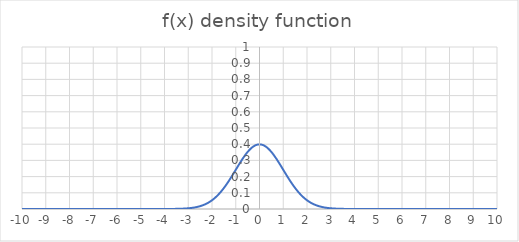
| Category | Series 0 |
|---|---|
| -10.0 | 0 |
| -9.9 | 0 |
| -9.8 | 0 |
| -9.7 | 0 |
| -9.6 | 0 |
| -9.5 | 0 |
| -9.4 | 0 |
| -9.3 | 0 |
| -9.2 | 0 |
| -9.1 | 0 |
| -9.0 | 0 |
| -8.9 | 0 |
| -8.8 | 0 |
| -8.7 | 0 |
| -8.6 | 0 |
| -8.50000000000001 | 0 |
| -8.40000000000001 | 0 |
| -8.30000000000001 | 0 |
| -8.20000000000001 | 0 |
| -8.10000000000001 | 0 |
| -8.00000000000001 | 0 |
| -7.90000000000001 | 0 |
| -7.80000000000001 | 0 |
| -7.70000000000001 | 0 |
| -7.60000000000001 | 0 |
| -7.50000000000001 | 0 |
| -7.40000000000001 | 0 |
| -7.30000000000001 | 0 |
| -7.20000000000001 | 0 |
| -7.10000000000001 | 0 |
| -7.00000000000001 | 0 |
| -6.90000000000001 | 0 |
| -6.80000000000001 | 0 |
| -6.70000000000001 | 0 |
| -6.60000000000001 | 0 |
| -6.50000000000001 | 0 |
| -6.40000000000001 | 0 |
| -6.30000000000001 | 0 |
| -6.20000000000001 | 0 |
| -6.10000000000001 | 0 |
| -6.00000000000001 | 0 |
| -5.90000000000001 | 0 |
| -5.80000000000001 | 0 |
| -5.70000000000002 | 0 |
| -5.60000000000002 | 0 |
| -5.50000000000002 | 0 |
| -5.40000000000002 | 0 |
| -5.30000000000002 | 0 |
| -5.20000000000002 | 0 |
| -5.10000000000002 | 0 |
| -5.00000000000002 | 0 |
| -4.90000000000002 | 0 |
| -4.80000000000002 | 0 |
| -4.70000000000002 | 0 |
| -4.60000000000002 | 0 |
| -4.50000000000002 | 0 |
| -4.40000000000002 | 0 |
| -4.30000000000002 | 0 |
| -4.20000000000002 | 0 |
| -4.10000000000002 | 0 |
| -4.00000000000002 | 0 |
| -3.90000000000002 | 0 |
| -3.80000000000002 | 0 |
| -3.70000000000002 | 0 |
| -3.60000000000002 | 0.001 |
| -3.50000000000002 | 0.001 |
| -3.40000000000002 | 0.001 |
| -3.30000000000002 | 0.002 |
| -3.20000000000002 | 0.002 |
| -3.10000000000002 | 0.003 |
| -3.00000000000002 | 0.004 |
| -2.90000000000003 | 0.006 |
| -2.80000000000003 | 0.008 |
| -2.70000000000003 | 0.01 |
| -2.60000000000003 | 0.014 |
| -2.50000000000003 | 0.018 |
| -2.40000000000003 | 0.022 |
| -2.30000000000003 | 0.028 |
| -2.20000000000003 | 0.035 |
| -2.10000000000003 | 0.044 |
| -2.00000000000003 | 0.054 |
| -1.90000000000003 | 0.066 |
| -1.80000000000003 | 0.079 |
| -1.70000000000003 | 0.094 |
| -1.60000000000003 | 0.111 |
| -1.50000000000003 | 0.13 |
| -1.40000000000003 | 0.15 |
| -1.30000000000003 | 0.171 |
| -1.20000000000003 | 0.194 |
| -1.10000000000003 | 0.218 |
| -1.00000000000003 | 0.242 |
| -0.900000000000031 | 0.266 |
| -0.800000000000029 | 0.29 |
| -0.700000000000029 | 0.312 |
| -0.60000000000003 | 0.333 |
| -0.50000000000003 | 0.352 |
| -0.400000000000031 | 0.368 |
| -0.300000000000029 | 0.381 |
| -0.200000000000029 | 0.391 |
| -0.100000000000041 | 0.397 |
| -4.08562073062058e-14 | 0.399 |
| 0.0999999999999996 | 0.397 |
| 0.199999999999999 | 0.391 |
| 0.300000000000001 | 0.381 |
| 0.4 | 0.368 |
| 0.5 | 0.352 |
| 0.6 | 0.333 |
| 0.699999999999999 | 0.312 |
| 0.800000000000001 | 0.29 |
| 0.9 | 0.266 |
| 1.0 | 0.242 |
| 1.1 | 0.218 |
| 1.2 | 0.194 |
| 1.3 | 0.171 |
| 1.4 | 0.15 |
| 1.5 | 0.13 |
| 1.6 | 0.111 |
| 1.7 | 0.094 |
| 1.8 | 0.079 |
| 1.9 | 0.066 |
| 2.0 | 0.054 |
| 2.1 | 0.044 |
| 2.2 | 0.035 |
| 2.3 | 0.028 |
| 2.4 | 0.022 |
| 2.5 | 0.018 |
| 2.6 | 0.014 |
| 2.7 | 0.01 |
| 2.8 | 0.008 |
| 2.9 | 0.006 |
| 3.0 | 0.004 |
| 3.1 | 0.003 |
| 3.2 | 0.002 |
| 3.3 | 0.002 |
| 3.4 | 0.001 |
| 3.5 | 0.001 |
| 3.6 | 0.001 |
| 3.7 | 0 |
| 3.8 | 0 |
| 3.9 | 0 |
| 4.0 | 0 |
| 4.0999999999999 | 0 |
| 4.1999999999999 | 0 |
| 4.2999999999999 | 0 |
| 4.3999999999999 | 0 |
| 4.4999999999999 | 0 |
| 4.5999999999999 | 0 |
| 4.6999999999999 | 0 |
| 4.7999999999999 | 0 |
| 4.8999999999999 | 0 |
| 4.9999999999999 | 0 |
| 5.0999999999999 | 0 |
| 5.1999999999999 | 0 |
| 5.2999999999999 | 0 |
| 5.3999999999999 | 0 |
| 5.4999999999999 | 0 |
| 5.5999999999999 | 0 |
| 5.6999999999999 | 0 |
| 5.7999999999999 | 0 |
| 5.8999999999999 | 0 |
| 5.9999999999999 | 0 |
| 6.0999999999999 | 0 |
| 6.1999999999999 | 0 |
| 6.2999999999999 | 0 |
| 6.3999999999999 | 0 |
| 6.4999999999999 | 0 |
| 6.5999999999999 | 0 |
| 6.6999999999999 | 0 |
| 6.7999999999999 | 0 |
| 6.8999999999999 | 0 |
| 6.9999999999999 | 0 |
| 7.0999999999999 | 0 |
| 7.1999999999999 | 0 |
| 7.2999999999999 | 0 |
| 7.3999999999999 | 0 |
| 7.4999999999999 | 0 |
| 7.5999999999999 | 0 |
| 7.6999999999999 | 0 |
| 7.7999999999999 | 0 |
| 7.8999999999999 | 0 |
| 7.9999999999999 | 0 |
| 8.0999999999999 | 0 |
| 8.1999999999999 | 0 |
| 8.2999999999999 | 0 |
| 8.3999999999999 | 0 |
| 8.4999999999999 | 0 |
| 8.5999999999999 | 0 |
| 8.6999999999999 | 0 |
| 8.7999999999999 | 0 |
| 8.8999999999999 | 0 |
| 8.9999999999999 | 0 |
| 9.0999999999999 | 0 |
| 9.1999999999999 | 0 |
| 9.2999999999999 | 0 |
| 9.3999999999999 | 0 |
| 9.4999999999999 | 0 |
| 9.5999999999999 | 0 |
| 9.6999999999999 | 0 |
| 9.7999999999999 | 0 |
| 9.8999999999999 | 0 |
| 9.9999999999999 | 0 |